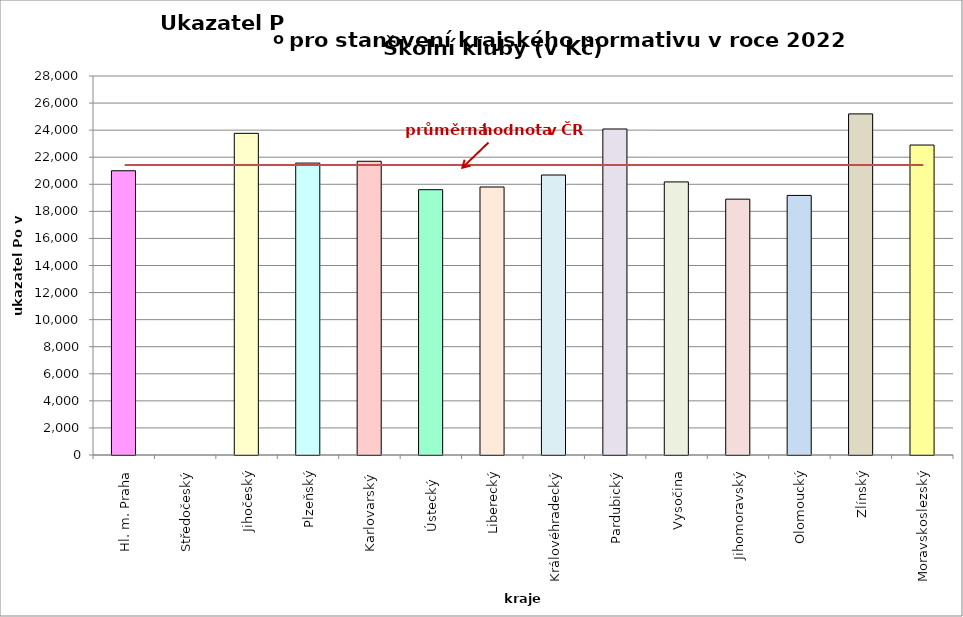
| Category | Series 0 |
|---|---|
| Hl. m. Praha | 21000 |
| Středočeský | 0 |
| Jihočeský | 23764 |
| Plzeňský | 21566 |
| Karlovarský  | 21700 |
| Ústecký   | 19600 |
| Liberecký | 19800 |
| Královéhradecký | 20686 |
| Pardubický | 24085 |
| Vysočina | 20175 |
| Jihomoravský | 18901 |
| Olomoucký | 19178 |
| Zlínský | 25200 |
| Moravskoslezský | 22900 |